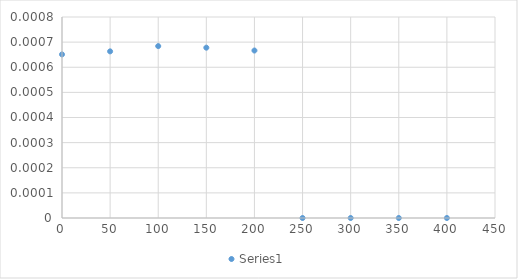
| Category | Series 0 |
|---|---|
| 0.0 | 0.001 |
| 50.0 | 0.001 |
| 100.0 | 0.001 |
| 150.0 | 0.001 |
| 200.0 | 0.001 |
| 250.0 | 0 |
| 300.0 | 0 |
| 350.0 | 0 |
| 400.0 | 0 |